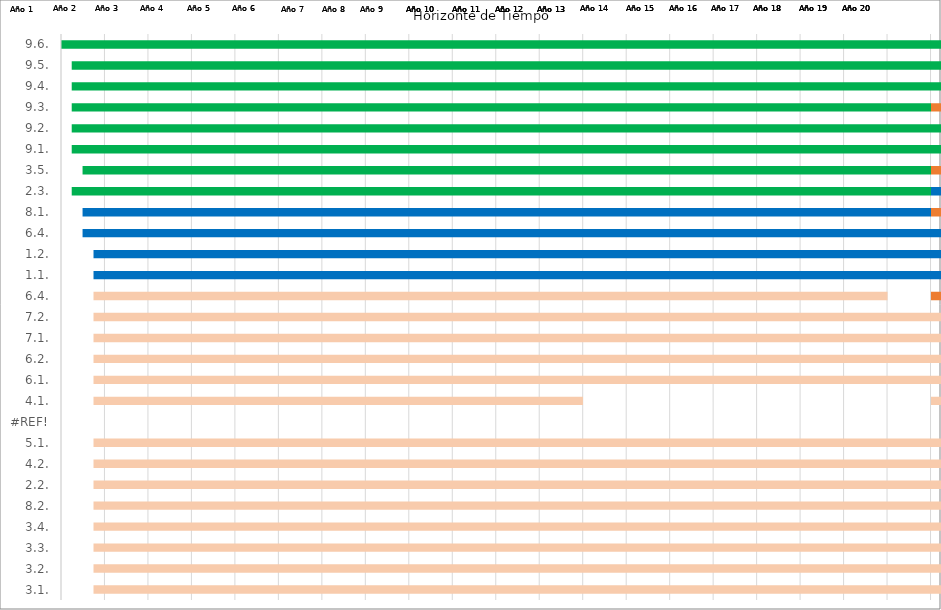
| Category | Series 2 | Series 3 | Series 0 | Series 1 |
|---|---|---|---|---|
| 3.1. | 10/1/23 | 7031 | 10/1/23 | 7031 |
| 3.2. | 10/1/23 | 7031 | 10/1/23 | 7031 |
| 3.3. | 10/1/23 | 7031 | 10/1/23 | 7031 |
| 3.4. | 10/1/23 | 7031 | 10/1/23 | 7031 |
| 8.2. | 10/1/23 | 7031 | 10/1/23 | 7031 |
| 2.2. | 10/1/23 | 7031 | 10/1/23 | 7031 |
| 4.2. | 10/1/23 | 7031 | 10/1/23 | 7031 |
| 5.1. | 10/1/23 | 7031 | 10/1/23 | 7031 |
| #¡REF! | 0 | 0 | 0 | 0 |
| 4.1. | 10/1/23 | 4109 | 10/1/23 | 4109 |
| 6.1. | 10/1/23 | 7031 | 10/1/23 | 7031 |
| 6.2. | 10/1/23 | 7031 | 10/1/23 | 7031 |
| 7.1. | 10/1/23 | 7031 | 10/1/23 | 7031 |
| 7.2. | 10/1/23 | 7031 | 10/1/23 | 7031 |
| 6.4. | 10/1/23 | 6666 | 10/1/23 | 6666 |
| 1.1. | 10/1/23 | 7031 | 10/1/23 | 7031 |
| 1.2. | 10/1/23 | 7031 | 10/1/23 | 7031 |
| 6.4. | 7/1/23 | 7123 | 7/1/23 | 7123 |
| 8.1. | 7/1/23 | 7123 | 7/1/23 | 7123 |
| 2.3. | 4/1/23 | 7214 | 4/1/23 | 7214 |
| 3.5. | 7/1/23 | 7123 | 7/1/23 | 7123 |
| 9.1. | 4/1/23 | 7214 | 4/1/23 | 7214 |
| 9.2. | 4/1/23 | 7214 | 4/1/23 | 7214 |
| 9.3. | 4/1/23 | 7214 | 4/1/23 | 7214 |
| 9.4. | 4/1/23 | 7214 | 4/1/23 | 7214 |
| 9.5. | 4/1/23 | 7214 | 4/1/23 | 7214 |
| 9.6. | 1/1/23 | 7304 | 1/1/23 | 7304 |